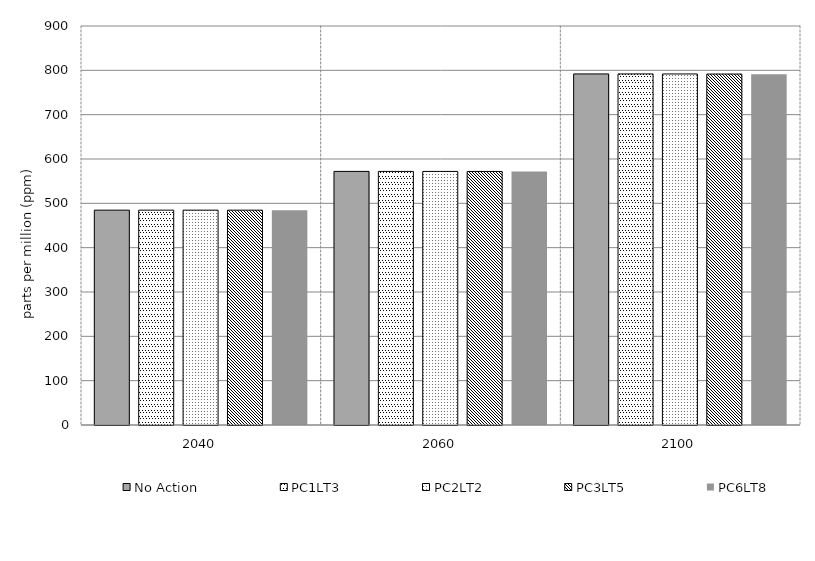
| Category | No Action | PC1LT3 | PC2LT2 | PC3LT5 | PC6LT8 | Alt 5 | Alt 6 | Alt 7 | Alt 8 | Alt 10 |
|---|---|---|---|---|---|---|---|---|---|---|
| 2040.0 | 484.639 | 484.628 | 484.621 | 484.604 | 484.546 |  |  |  |  |  |
| 2060.0 | 572.027 | 572.009 | 571.981 | 571.916 | 571.691 |  |  |  |  |  |
| 2100.0 | 791.896 | 791.873 | 791.803 | 791.649 | 791.135 |  |  |  |  |  |